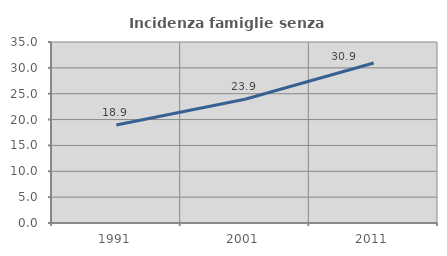
| Category | Incidenza famiglie senza nuclei |
|---|---|
| 1991.0 | 18.939 |
| 2001.0 | 23.92 |
| 2011.0 | 30.937 |